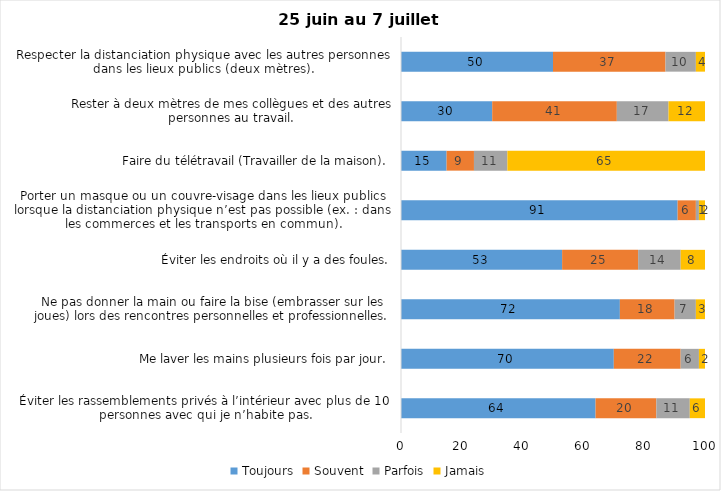
| Category | Toujours | Souvent | Parfois | Jamais |
|---|---|---|---|---|
| Éviter les rassemblements privés à l’intérieur avec plus de 10 personnes avec qui je n’habite pas. | 64 | 20 | 11 | 6 |
| Me laver les mains plusieurs fois par jour. | 70 | 22 | 6 | 2 |
| Ne pas donner la main ou faire la bise (embrasser sur les joues) lors des rencontres personnelles et professionnelles. | 72 | 18 | 7 | 3 |
| Éviter les endroits où il y a des foules. | 53 | 25 | 14 | 8 |
| Porter un masque ou un couvre-visage dans les lieux publics lorsque la distanciation physique n’est pas possible (ex. : dans les commerces et les transports en commun). | 91 | 6 | 1 | 2 |
| Faire du télétravail (Travailler de la maison). | 15 | 9 | 11 | 65 |
| Rester à deux mètres de mes collègues et des autres personnes au travail. | 30 | 41 | 17 | 12 |
| Respecter la distanciation physique avec les autres personnes dans les lieux publics (deux mètres). | 50 | 37 | 10 | 4 |